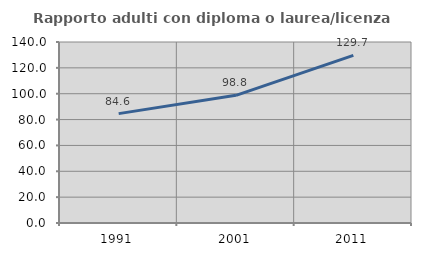
| Category | Rapporto adulti con diploma o laurea/licenza media  |
|---|---|
| 1991.0 | 84.586 |
| 2001.0 | 98.765 |
| 2011.0 | 129.703 |